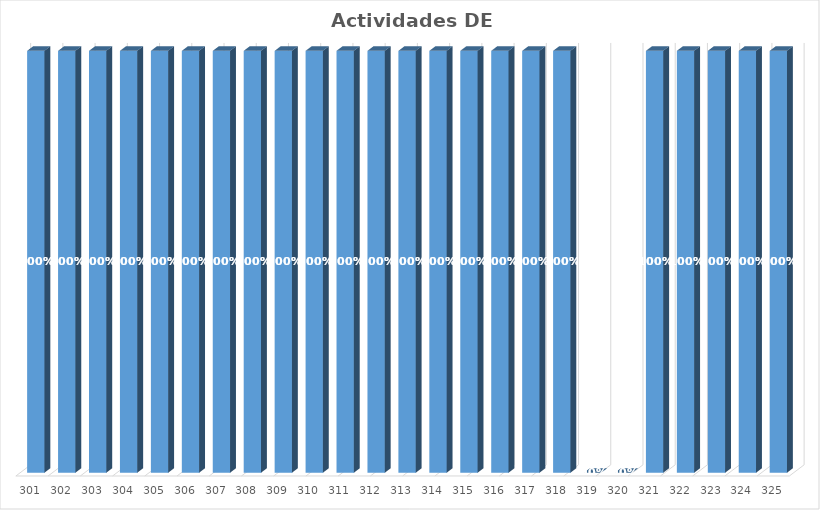
| Category | % Avance |
|---|---|
| 301.0 | 1 |
| 302.0 | 1 |
| 303.0 | 1 |
| 304.0 | 1 |
| 305.0 | 1 |
| 306.0 | 1 |
| 307.0 | 1 |
| 308.0 | 1 |
| 309.0 | 1 |
| 310.0 | 1 |
| 311.0 | 1 |
| 312.0 | 1 |
| 313.0 | 1 |
| 314.0 | 1 |
| 315.0 | 1 |
| 316.0 | 1 |
| 317.0 | 1 |
| 318.0 | 1 |
| 319.0 | 0.9 |
| 320.0 | 0.9 |
| 321.0 | 1 |
| 322.0 | 1 |
| 323.0 | 1 |
| 324.0 | 1 |
| 325.0 | 1 |